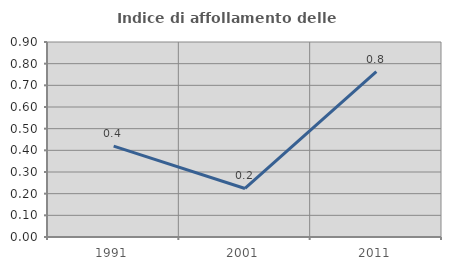
| Category | Indice di affollamento delle abitazioni  |
|---|---|
| 1991.0 | 0.419 |
| 2001.0 | 0.224 |
| 2011.0 | 0.763 |